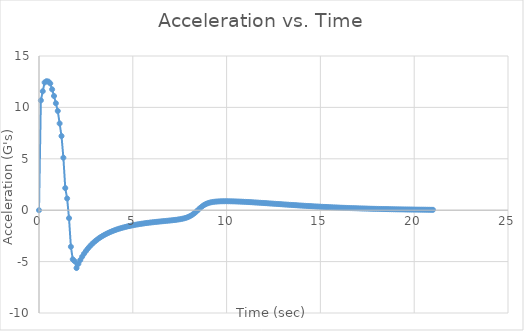
| Category | Series 0 |
|---|---|
| 0.0 | 0 |
| 0.1 | 10.683 |
| 0.2 | 11.572 |
| 0.30000000000000004 | 12.427 |
| 0.4 | 12.545 |
| 0.5 | 12.516 |
| 0.6 | 12.333 |
| 0.7 | 11.755 |
| 0.7999999999999999 | 11.109 |
| 0.8999999999999999 | 10.405 |
| 0.9999999999999999 | 9.653 |
| 1.0999999999999999 | 8.438 |
| 1.2 | 7.212 |
| 1.3 | 5.107 |
| 1.4000000000000001 | 2.154 |
| 1.5000000000000002 | 1.139 |
| 1.6000000000000003 | -0.772 |
| 1.7000000000000004 | -3.557 |
| 1.8000000000000005 | -4.776 |
| 1.9000000000000006 | -4.968 |
| 2.0000000000000004 | -5.626 |
| 2.1000000000000005 | -5.214 |
| 2.2000000000000006 | -4.849 |
| 2.3000000000000007 | -4.525 |
| 2.400000000000001 | -4.235 |
| 2.500000000000001 | -3.975 |
| 2.600000000000001 | -3.742 |
| 2.700000000000001 | -3.53 |
| 2.800000000000001 | -3.339 |
| 2.9000000000000012 | -3.165 |
| 3.0000000000000013 | -3.006 |
| 3.1000000000000014 | -2.861 |
| 3.2000000000000015 | -2.727 |
| 3.3000000000000016 | -2.605 |
| 3.4000000000000017 | -2.492 |
| 3.5000000000000018 | -2.388 |
| 3.600000000000002 | -2.292 |
| 3.700000000000002 | -2.203 |
| 3.800000000000002 | -2.121 |
| 3.900000000000002 | -2.044 |
| 4.000000000000002 | -1.972 |
| 4.100000000000001 | -1.906 |
| 4.200000000000001 | -1.844 |
| 4.300000000000001 | -1.785 |
| 4.4 | -1.731 |
| 4.5 | -1.68 |
| 4.6 | -1.632 |
| 4.699999999999999 | -1.587 |
| 4.799999999999999 | -1.545 |
| 4.899999999999999 | -1.505 |
| 4.999999999999998 | -1.468 |
| 5.099999999999998 | -1.432 |
| 5.1999999999999975 | -1.399 |
| 5.299999999999997 | -1.367 |
| 5.399999999999997 | -1.338 |
| 5.4999999999999964 | -1.309 |
| 5.599999999999996 | -1.283 |
| 5.699999999999996 | -1.257 |
| 5.799999999999995 | -1.233 |
| 5.899999999999995 | -1.21 |
| 5.999999999999995 | -1.188 |
| 6.099999999999994 | -1.167 |
| 6.199999999999994 | -1.147 |
| 6.299999999999994 | -1.127 |
| 6.399999999999993 | -1.108 |
| 6.499999999999993 | -1.09 |
| 6.5999999999999925 | -1.072 |
| 6.699999999999992 | -1.054 |
| 6.799999999999992 | -1.036 |
| 6.8999999999999915 | -1.018 |
| 6.999999999999991 | -0.999 |
| 7.099999999999991 | -0.979 |
| 7.19999999999999 | -0.959 |
| 7.29999999999999 | -0.936 |
| 7.39999999999999 | -0.911 |
| 7.499999999999989 | -0.882 |
| 7.599999999999989 | -0.848 |
| 7.699999999999989 | -0.808 |
| 7.799999999999988 | -0.759 |
| 7.899999999999988 | -0.699 |
| 7.999999999999988 | -0.623 |
| 8.099999999999987 | -0.528 |
| 8.199999999999987 | -0.411 |
| 8.299999999999986 | -0.27 |
| 8.399999999999986 | -0.109 |
| 8.499999999999986 | 0.062 |
| 8.599999999999985 | 0.229 |
| 8.699999999999985 | 0.379 |
| 8.799999999999985 | 0.504 |
| 8.899999999999984 | 0.603 |
| 8.999999999999984 | 0.678 |
| 9.099999999999984 | 0.735 |
| 9.199999999999983 | 0.777 |
| 9.299999999999983 | 0.808 |
| 9.399999999999983 | 0.83 |
| 9.499999999999982 | 0.847 |
| 9.599999999999982 | 0.858 |
| 9.699999999999982 | 0.865 |
| 9.799999999999981 | 0.87 |
| 9.89999999999998 | 0.872 |
| 9.99999999999998 | 0.872 |
| 10.09999999999998 | 0.87 |
| 10.19999999999998 | 0.867 |
| 10.29999999999998 | 0.862 |
| 10.399999999999979 | 0.857 |
| 10.499999999999979 | 0.851 |
| 10.599999999999978 | 0.843 |
| 10.699999999999978 | 0.836 |
| 10.799999999999978 | 0.827 |
| 10.899999999999977 | 0.818 |
| 10.999999999999977 | 0.809 |
| 11.099999999999977 | 0.799 |
| 11.199999999999976 | 0.788 |
| 11.299999999999976 | 0.777 |
| 11.399999999999975 | 0.766 |
| 11.499999999999975 | 0.755 |
| 11.599999999999975 | 0.743 |
| 11.699999999999974 | 0.732 |
| 11.799999999999974 | 0.719 |
| 11.899999999999974 | 0.707 |
| 11.999999999999973 | 0.695 |
| 12.099999999999973 | 0.682 |
| 12.199999999999973 | 0.67 |
| 12.299999999999972 | 0.657 |
| 12.399999999999972 | 0.644 |
| 12.499999999999972 | 0.632 |
| 12.599999999999971 | 0.619 |
| 12.69999999999997 | 0.606 |
| 12.79999999999997 | 0.593 |
| 12.89999999999997 | 0.581 |
| 12.99999999999997 | 0.568 |
| 13.09999999999997 | 0.555 |
| 13.199999999999969 | 0.543 |
| 13.299999999999969 | 0.53 |
| 13.399999999999968 | 0.518 |
| 13.499999999999968 | 0.506 |
| 13.599999999999968 | 0.494 |
| 13.699999999999967 | 0.482 |
| 13.799999999999967 | 0.47 |
| 13.899999999999967 | 0.458 |
| 13.999999999999966 | 0.446 |
| 14.099999999999966 | 0.435 |
| 14.199999999999966 | 0.424 |
| 14.299999999999965 | 0.412 |
| 14.399999999999965 | 0.401 |
| 14.499999999999964 | 0.391 |
| 14.599999999999964 | 0.38 |
| 14.699999999999964 | 0.37 |
| 14.799999999999963 | 0.359 |
| 14.899999999999963 | 0.349 |
| 14.999999999999963 | 0.339 |
| 15.099999999999962 | 0.33 |
| 15.199999999999962 | 0.32 |
| 15.299999999999962 | 0.311 |
| 15.399999999999961 | 0.302 |
| 15.499999999999961 | 0.293 |
| 15.59999999999996 | 0.284 |
| 15.69999999999996 | 0.276 |
| 15.79999999999996 | 0.267 |
| 15.89999999999996 | 0.259 |
| 15.99999999999996 | 0.251 |
| 16.09999999999996 | 0.244 |
| 16.19999999999996 | 0.236 |
| 16.29999999999996 | 0.229 |
| 16.399999999999963 | 0.221 |
| 16.499999999999964 | 0.214 |
| 16.599999999999966 | 0.207 |
| 16.699999999999967 | 0.201 |
| 16.79999999999997 | 0.194 |
| 16.89999999999997 | 0.188 |
| 16.99999999999997 | 0.182 |
| 17.099999999999973 | 0.176 |
| 17.199999999999974 | 0.17 |
| 17.299999999999976 | 0.164 |
| 17.399999999999977 | 0.159 |
| 17.49999999999998 | 0.153 |
| 17.59999999999998 | 0.148 |
| 17.69999999999998 | 0.143 |
| 17.799999999999983 | 0.138 |
| 17.899999999999984 | 0.133 |
| 17.999999999999986 | 0.128 |
| 18.099999999999987 | 0.124 |
| 18.19999999999999 | 0.119 |
| 18.29999999999999 | 0.115 |
| 18.39999999999999 | 0.111 |
| 18.499999999999993 | 0.107 |
| 18.599999999999994 | 0.103 |
| 18.699999999999996 | 0.099 |
| 18.799999999999997 | 0.096 |
| 18.9 | 0.092 |
| 19.0 | 0.089 |
| 19.1 | 0.085 |
| 19.200000000000003 | 0.082 |
| 19.300000000000004 | 0.079 |
| 19.400000000000006 | 0.076 |
| 19.500000000000007 | 0.073 |
| 19.60000000000001 | 0.07 |
| 19.70000000000001 | 0.067 |
| 19.80000000000001 | 0.064 |
| 19.900000000000013 | 0.062 |
| 20.000000000000014 | 0.059 |
| 20.100000000000016 | 0.057 |
| 20.200000000000017 | 0.054 |
| 20.30000000000002 | 0.052 |
| 20.40000000000002 | 0.05 |
| 20.50000000000002 | 0.048 |
| 20.600000000000023 | 0.046 |
| 20.700000000000024 | 0.044 |
| 20.800000000000026 | 0.042 |
| 20.900000000000027 | 0.04 |
| 21.00000000000003 | 0.038 |